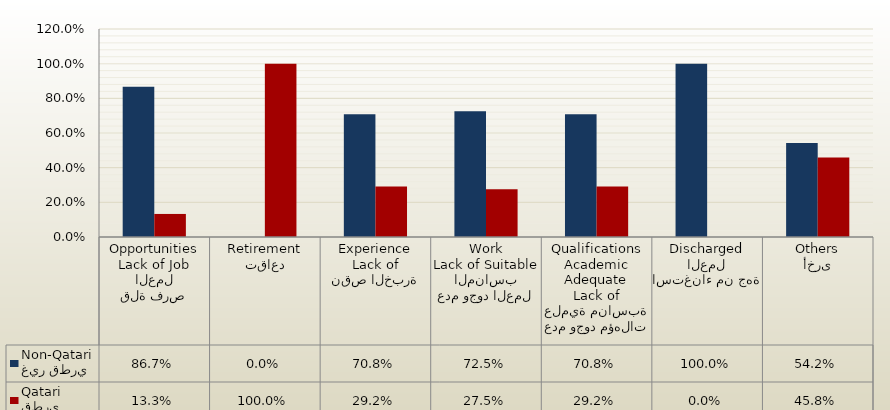
| Category | غير قطري
Non-Qatari | قطري
Qatari |
|---|---|---|
| قلة فرص العمل
Lack of Job Opportunities | 0.867 | 0.133 |
| تقاعد
Retirement | 0 | 1 |
| نقص الخبرة
Lack of Experience | 0.708 | 0.292 |
| عدم وجود العمل المناسب
Lack of Suitable Work | 0.725 | 0.275 |
| عدم وجود مؤهلات علمية مناسبة
Lack of Adequate Academic Qualifications | 0.708 | 0.292 |
| استغناء من جهة العمل
Discharged | 1 | 0 |
| أخرى
Others | 0.542 | 0.458 |